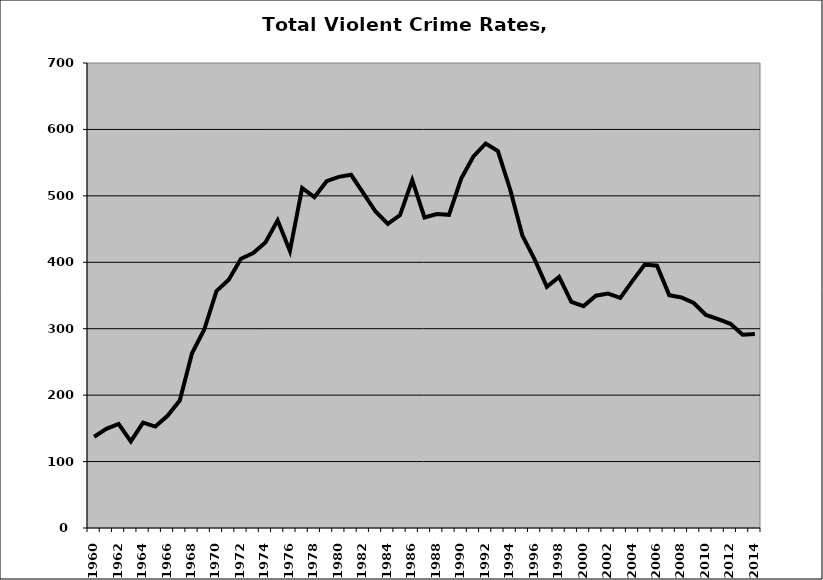
| Category | VCR |
|---|---|
| 1960.0 | 137.29 |
| 1961.0 | 149.298 |
| 1962.0 | 156.791 |
| 1963.0 | 130.291 |
| 1964.0 | 158.647 |
| 1965.0 | 152.717 |
| 1966.0 | 168.943 |
| 1967.0 | 191.848 |
| 1968.0 | 263.037 |
| 1969.0 | 298.81 |
| 1970.0 | 356.732 |
| 1971.0 | 373.631 |
| 1972.0 | 405.388 |
| 1973.0 | 413.952 |
| 1974.0 | 429.808 |
| 1975.0 | 463.102 |
| 1976.0 | 416.957 |
| 1977.0 | 511.913 |
| 1978.0 | 497.978 |
| 1979.0 | 522.078 |
| 1980.0 | 528.591 |
| 1981.0 | 531.725 |
| 1982.0 | 504.236 |
| 1983.0 | 476.426 |
| 1984.0 | 457.772 |
| 1985.0 | 471.031 |
| 1986.0 | 523.569 |
| 1987.0 | 467.506 |
| 1988.0 | 472.584 |
| 1989.0 | 471.39 |
| 1990.0 | 525.984 |
| 1991.0 | 559.283 |
| 1992.0 | 578.847 |
| 1993.0 | 567.274 |
| 1994.0 | 509.628 |
| 1995.0 | 440.192 |
| 1996.0 | 404.473 |
| 1997.0 | 363.19 |
| 1998.0 | 377.94 |
| 1999.0 | 340.497 |
| 2000.0 | 334.018 |
| 2001.0 | 349.628 |
| 2002.0 | 352.851 |
| 2003.0 | 346.488 |
| 2004.0 | 372.048 |
| 2005.0 | 396.672 |
| 2006.0 | 394.814 |
| 2007.0 | 350.57 |
| 2008.0 | 347.077 |
| 2009.0 | 338.763 |
| 2010.0 | 320.787 |
| 2011.0 | 314.387 |
| 2012.0 | 307.373 |
| 2013.0 | 290.853 |
| 2014.0 | 291.942 |